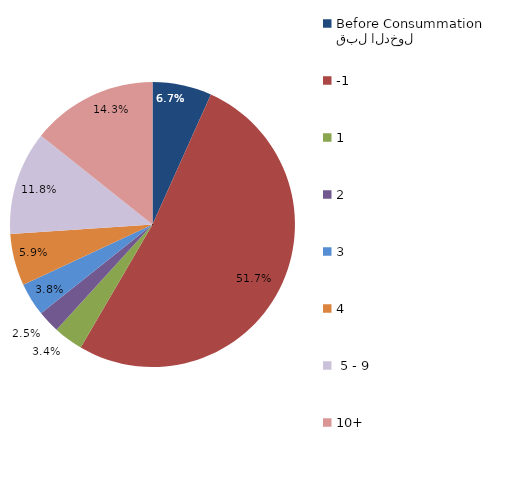
| Category | Series 0 |
|---|---|
| قبل الدخول
Before Consummation | 6.723 |
| -1 | 51.681 |
| 1 | 3.361 |
| 2 | 2.521 |
| 3 | 3.782 |
| 4 | 5.882 |
|  5 - 9 | 11.765 |
| 10+ | 14.286 |